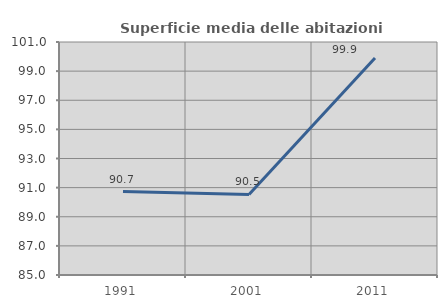
| Category | Superficie media delle abitazioni occupate |
|---|---|
| 1991.0 | 90.729 |
| 2001.0 | 90.528 |
| 2011.0 | 99.908 |